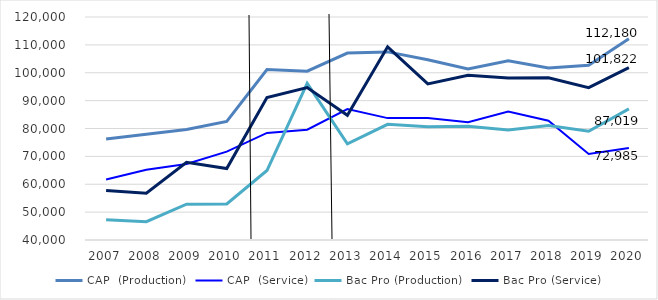
| Category | CAP  (Production)  | CAP  (Service) | Bac Pro (Production)  | Bac Pro (Service) |
|---|---|---|---|---|
| 2007.0 | 76241 | 61731 | 47245 | 57730 |
| 2008.0 | 77946 | 65209 | 46561 | 56750 |
| 2009.0 | 79613 | 67258 | 52845 | 67883 |
| 2010.0 | 82553 | 71712 | 52951 | 65635 |
| 2011.0 | 101157 | 78407 | 64928 | 91135 |
| 2012.0 | 100578 | 79555 | 96191 | 94708 |
| 2013.0 | 107046 | 86976 | 74500 | 84741 |
| 2014.0 | 107481 | 83722 | 81479 | 109294 |
| 2015.0 | 104657 | 83729 | 80650 | 95996 |
| 2016.0 | 101391 | 82227 | 80766 | 99075 |
| 2017.0 | 104302 | 86069 | 79467 | 98103 |
| 2018.0 | 101704 | 82806 | 81091 | 98171 |
| 2019.0 | 102681.991 | 70870.009 | 79010 | 94665 |
| 2020.0 | 112180 | 72985 | 87019 | 101822 |